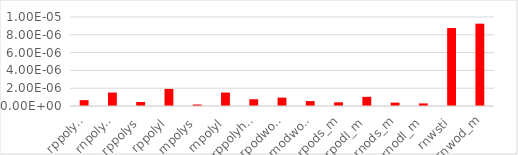
| Category | Series 0 |
|---|---|
| rppolywo | 0 |
| rnpolywo | 0 |
| rppolys | 0 |
| rppolyl | 0 |
| rnpolys | 0 |
| rnpolyl | 0 |
| rppolyhri | 0 |
| rpodwo_m | 0 |
| rnodwo_m | 0 |
| rpods_m | 0 |
| rpodl_m | 0 |
| rnods_m | 0 |
| rnodl_m | 0 |
| rnwsti | 0 |
| rnwod_m | 0 |